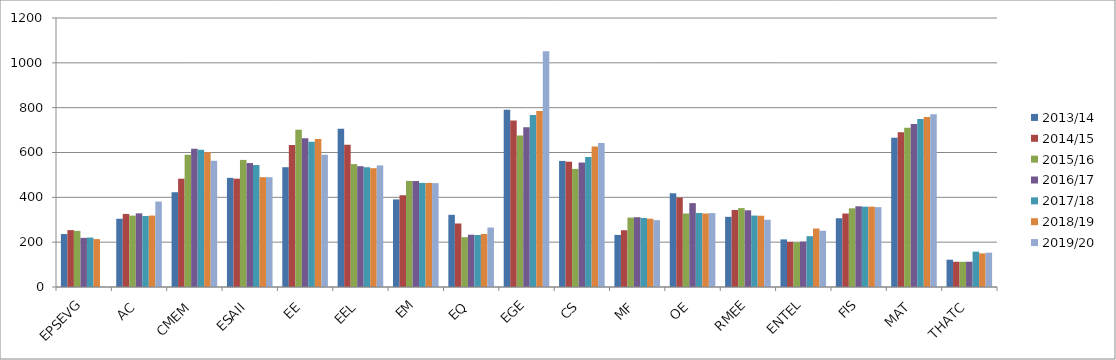
| Category | 2013/14 | 2014/15 | 2015/16 | 2016/17 | 2017/18 | 2018/19 | 2019/20 |
|---|---|---|---|---|---|---|---|
| EPSEVG | 236.21 | 253.76 | 250.25 | 219.142 | 220.742 | 213.699 | 0 |
| AC | 304.33 | 326 | 318.5 | 328.58 | 316.55 | 318.61 | 381.28 |
| CMEM | 422.78 | 483.14 | 589.525 | 617.17 | 612.267 | 601.49 | 563.118 |
| ESAII | 486.94 | 483.27 | 567 | 552.905 | 544.059 | 489.96 | 489.831 |
| EE | 534.44 | 633.19 | 701.6 | 663.57 | 648.45 | 660.34 | 590.37 |
| EEL | 705.89 | 634.64 | 548.15 | 538.866 | 534.172 | 529.952 | 542.478 |
| EM | 390.72 | 409.34 | 473.13 | 472.71 | 464.5 | 464.2 | 463.55 |
| EQ | 321.99 | 283.35 | 222.25 | 233.248 | 231.946 | 236.746 | 265.245 |
| EGE | 790.58 | 742.58 | 675.95 | 712.96 | 767.517 | 785.03 | 1051.541 |
| CS | 562.37 | 559.01 | 526.91 | 555.16 | 579.6 | 626.94 | 641.92 |
| MF | 232.35 | 253.14 | 309.75 | 311.278 | 307.891 | 304.662 | 298.108 |
| OE | 418.04 | 398.58 | 327.765 | 374.17 | 330.3 | 327.85 | 329.7 |
| RMEE | 313.03 | 343.6 | 351.98 | 342.22 | 318.7 | 317.9 | 299.8 |
| ENTEL | 212.37 | 201.01 | 199 | 202.495 | 226.655 | 260.831 | 251.089 |
| FIS | 306.68 | 327.75 | 351 | 360 | 358.2 | 358.4 | 356.35 |
| MAT | 665.55 | 690 | 710.75 | 727.062 | 749.349 | 758.19 | 770.871 |
| THATC | 121.8 | 112.5 | 112.5 | 112.804 | 157.804 | 150 | 153 |